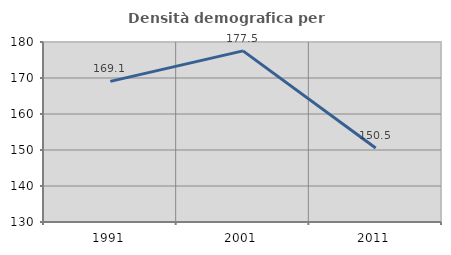
| Category | Densità demografica |
|---|---|
| 1991.0 | 169.067 |
| 2001.0 | 177.54 |
| 2011.0 | 150.545 |